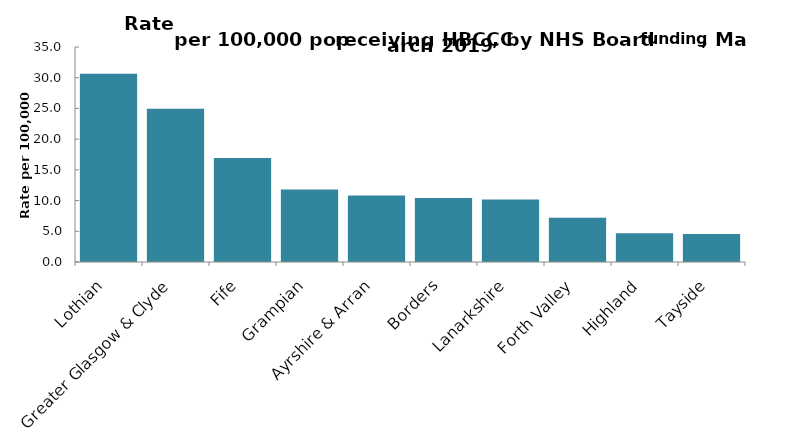
| Category | Series 0 |
|---|---|
| Tayside | 4.57 |
| Highland | 4.66 |
| Forth Valley | 7.19 |
| Lanarkshire | 10.16 |
| Borders | 10.41 |
| Ayrshire & Arran | 10.82 |
| Grampian | 11.8 |
| Fife | 16.94 |
| Greater Glasgow & Clyde | 24.94 |
| Lothian | 30.63 |